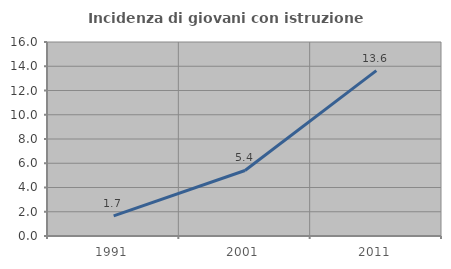
| Category | Incidenza di giovani con istruzione universitaria |
|---|---|
| 1991.0 | 1.664 |
| 2001.0 | 5.405 |
| 2011.0 | 13.636 |